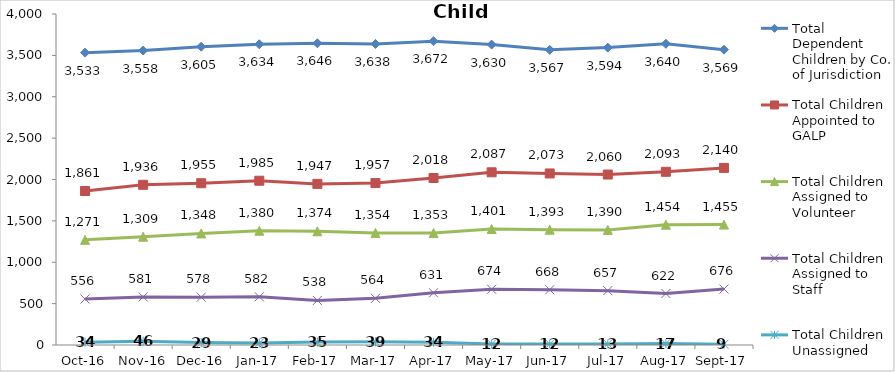
| Category | Total Dependent Children by Co. of Jurisdiction | Total Children Appointed to GALP | Total Children Assigned to Volunteer | Total Children Assigned to Staff | Total Children Unassigned |
|---|---|---|---|---|---|
| 2016-10-01 | 3533 | 1861 | 1271 | 556 | 34 |
| 2016-11-01 | 3558 | 1936 | 1309 | 581 | 46 |
| 2016-12-01 | 3605 | 1955 | 1348 | 578 | 29 |
| 2017-01-01 | 3634 | 1985 | 1380 | 582 | 23 |
| 2017-02-01 | 3646 | 1947 | 1374 | 538 | 35 |
| 2017-03-01 | 3638 | 1957 | 1354 | 564 | 39 |
| 2017-04-01 | 3672 | 2018 | 1353 | 631 | 34 |
| 2017-05-01 | 3630 | 2087 | 1401 | 674 | 12 |
| 2017-06-01 | 3567 | 2073 | 1393 | 668 | 12 |
| 2017-07-01 | 3594 | 2060 | 1390 | 657 | 13 |
| 2017-08-01 | 3640 | 2093 | 1454 | 622 | 17 |
| 2017-09-01 | 3569 | 2140 | 1455 | 676 | 9 |